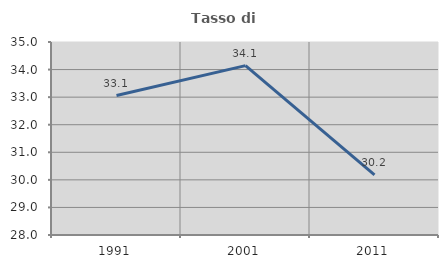
| Category | Tasso di occupazione   |
|---|---|
| 1991.0 | 33.056 |
| 2001.0 | 34.142 |
| 2011.0 | 30.178 |